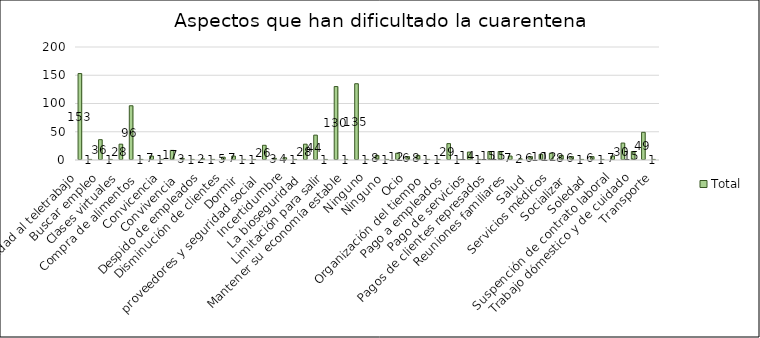
| Category | Total |
|---|---|
| Adaptabilidad al teletrabajo | 153 |
| Ambiente político  | 1 |
| Buscar empleo | 36 |
| Ciudados sanitarios | 1 |
| Clases virtuales | 28 |
| Compra de alimentos | 96 |
| Compra de alimentos  | 1 |
| Comprar alimentos | 7 |
| Convicencia | 1 |
| Convivencia | 17 |
| Convivencia  | 3 |
| Cuidado sanitario | 1 |
| Despido de empleados | 2 |
| Despido de empleados  | 1 |
| Disminución de clientes | 5 |
| Dormir | 7 |
| Dormir  | 1 |
| El pago de nómina, proveedores y seguridad social  | 1 |
| Estabilidad emocional | 26 |
| Incertidumbre | 3 |
| Inseguridad en las calles | 4 |
| La bioseguridad  | 1 |
| Limitación al salir | 28 |
| Limitación para salir | 44 |
| Manejo del tiempo | 1 |
| Mantener su economía estable | 130 |
| Nignuno | 1 |
| Ninguno | 135 |
| Ningúno | 1 |
| Ninguno  | 8 |
| No responde | 1 |
| Ocio | 12 |
| Organización del tiempo | 6 |
| Organización del tiempo  | 8 |
| Paciencia | 1 |
| Pago a empleados  | 1 |
| Pago de deudas | 29 |
| Pago de servicios | 1 |
| Pago de servicios públicos | 14 |
| Pagos de clientes represados | 1 |
| Realizar actividad física | 15 |
| Reuniones familiares | 15 |
| Salud | 7 |
| Salud  | 2 |
| Servicios de salud | 6 |
| Servicios médicos | 10 |
| Socializar | 12 |
| Socializar  | 8 |
| Soledad | 6 |
| Soledad  | 1 |
| Suspención de actividades laborales | 6 |
| Suspención de contrato laboral | 1 |
| Trabajo de doméstico y de cuidado | 7 |
| Trabajo dómestico y de cuidado | 30 |
| Tramites bancarios | 15 |
| Transporte | 49 |
| Transporte  | 1 |